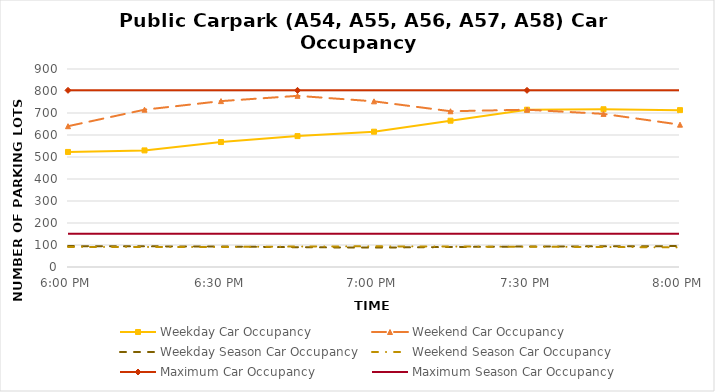
| Category | Weekday Car Occupancy | Weekend Car Occupancy | Weekday Season Car Occupancy | Weekend Season Car Occupancy | Maximum Car Occupancy | Maximum Season Car Occupancy |
|---|---|---|---|---|---|---|
| 0.75 | 523 | 640 | 95 | 91 | 803 | 151 |
| 0.760416666666667 | 530 | 715 | 94 | 91 | 803 | 151 |
| 0.770833333333333 | 568 | 754 | 93 | 91 | 803 | 151 |
| 0.78125 | 595 | 778 | 90 | 93 | 803 | 151 |
| 0.791666666666667 | 615 | 753 | 88 | 94 | 803 | 151 |
| 0.802083333333333 | 665 | 708 | 91 | 93 | 803 | 151 |
| 0.8125 | 715 | 715 | 93 | 92 | 803 | 151 |
| 0.822916666666667 | 717 | 696 | 94 | 91 | 803 | 151 |
| 0.833333333333333 | 713 | 647 | 95 | 89 | 803 | 151 |